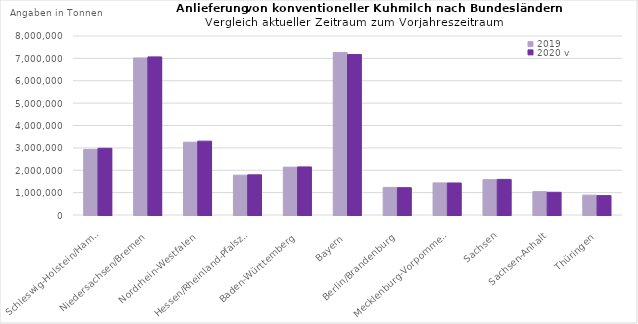
| Category | 2019 | 2020 v |
|---|---|---|
| Schleswig-Holstein/Hamburg | 2932517.059 | 2982246.713 |
| Niedersachsen/Bremen | 7019651.158 | 7066800.654 |
| Nordrhein-Westfalen | 3254577.269 | 3300468.463 |
| Hessen/Rheinland-PfalszSaarland | 1779715.838 | 1795998.321 |
| Baden-Württemberg | 2138576.098 | 2148526.393 |
| Bayern | 7259667.135 | 7171899.893 |
| Berlin/Brandenburg | 1233217.978 | 1221095.3 |
| Mecklenburg-Vorpommern | 1434139.722 | 1431047.006 |
| Sachsen | 1578260.13 | 1591312.599 |
| Sachsen-Anhalt | 1044234.522 | 1015992.188 |
| Thüringen | 887789.151 | 866795.337 |